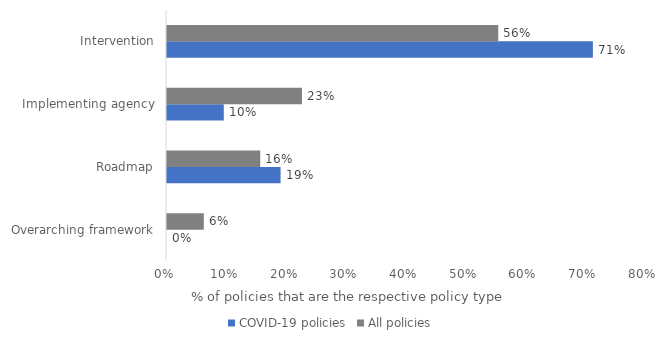
| Category | COVID-19 policies | All policies |
|---|---|---|
| Overarching framework | 0 | 0.062 |
| Roadmap | 0.19 | 0.156 |
| Implementing agency | 0.095 | 0.226 |
| Intervention | 0.714 | 0.556 |